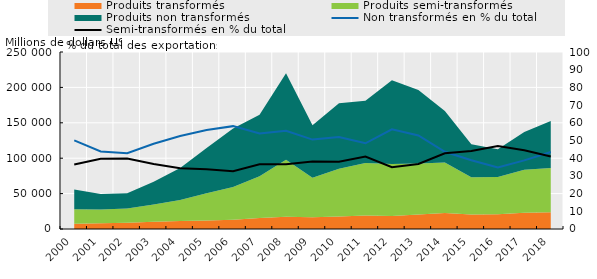
| Category | Non transformés en % du total | Semi-transformés en % du total |
|---|---|---|
| 2000.0 | 50.077 | 36.387 |
| 2001.0 | 43.778 | 39.665 |
| 2002.0 | 42.819 | 39.801 |
| 2003.0 | 48.142 | 36.745 |
| 2004.0 | 52.586 | 34.387 |
| 2005.0 | 55.915 | 33.706 |
| 2006.0 | 58.111 | 32.683 |
| 2007.0 | 53.945 | 36.514 |
| 2008.0 | 55.497 | 36.586 |
| 2009.0 | 50.508 | 38.126 |
| 2010.0 | 51.947 | 38.059 |
| 2011.0 | 48.437 | 40.949 |
| 2012.0 | 56.311 | 34.885 |
| 2013.0 | 52.827 | 36.72 |
| 2014.0 | 43.633 | 42.766 |
| 2015.0 | 38.874 | 44.061 |
| 2016.0 | 34.778 | 46.879 |
| 2017.0 | 38.777 | 44.515 |
| 2018.0 | 43.502 | 40.951 |